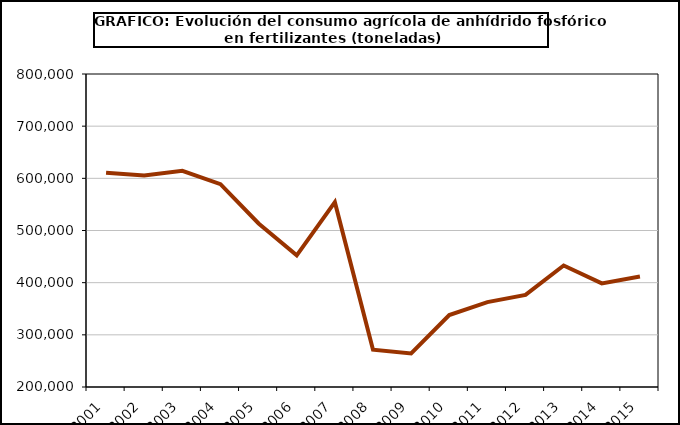
| Category | fertilizantes |
|---|---|
| 2001.0 | 610838 |
| 2002.0 | 605224 |
| 2003.0 | 614385 |
| 2004.0 | 588820 |
| 2005.0 | 513454 |
| 2006.0 | 452461 |
| 2007.0 | 554382 |
| 2008.0 | 271578 |
| 2009.0 | 264211 |
| 2010.0 | 337812 |
| 2011.0 | 362672 |
| 2012.0 | 376590 |
| 2013.0 | 432904 |
| 2014.0 | 398580 |
| 2015.0 | 411763 |